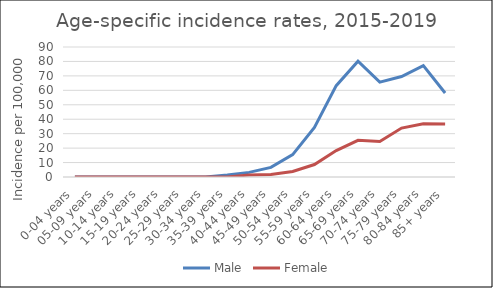
| Category | Male | Female |
|---|---|---|
| 0-04 years | 0 | 0 |
| 05-09 years | 0 | 0 |
| 10-14 years | 0 | 0 |
| 15-19 years | 0 | 0 |
| 20-24 years | 0 | 0 |
| 25-29 years | 0 | 0 |
| 30-34 years | 0 | 0 |
| 35-39 years | 1.43 | 0 |
| 40-44 years | 3.2 | 1.44 |
| 45-49 years | 6.65 | 1.74 |
| 50-54 years | 15.48 | 3.81 |
| 55-59 years | 34.27 | 8.63 |
| 60-64 years | 63.25 | 18.32 |
| 65-69 years | 80.2 | 25.39 |
| 70-74 years | 65.7 | 24.62 |
| 75-79 years | 69.59 | 33.86 |
| 80-84 years | 77.07 | 36.91 |
| 85+ years | 58.17 | 36.67 |